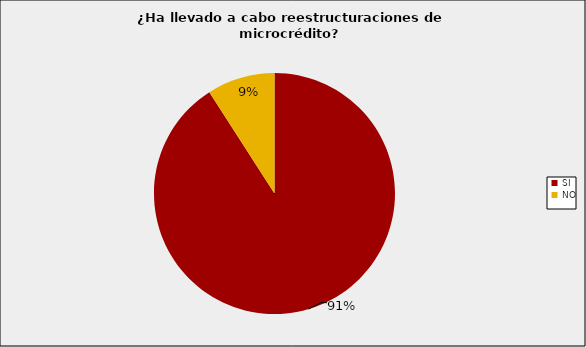
| Category | Entidades Supervisadas SFC |
|---|---|
| SI | 0.909 |
| NO | 0.091 |